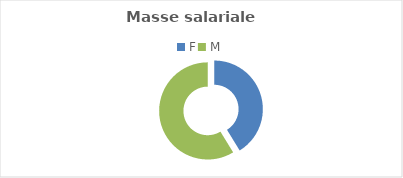
| Category | Masse salariale  |
|---|---|
| F | 1115514 |
| M | 1589179 |